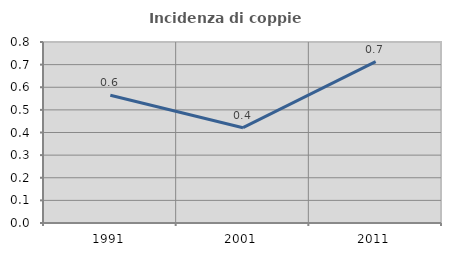
| Category | Incidenza di coppie miste |
|---|---|
| 1991.0 | 0.564 |
| 2001.0 | 0.421 |
| 2011.0 | 0.713 |